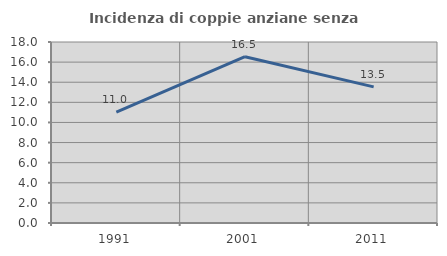
| Category | Incidenza di coppie anziane senza figli  |
|---|---|
| 1991.0 | 11.024 |
| 2001.0 | 16.535 |
| 2011.0 | 13.534 |